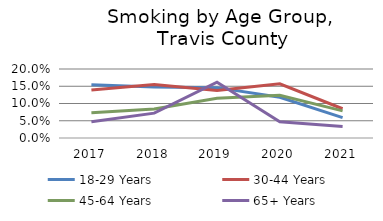
| Category | 18-29 Years  | 30-44 Years  | 45-64 Years | 65+ Years  |
|---|---|---|---|---|
| 2017.0 | 0.154 | 0.139 | 0.073 | 0.047 |
| 2018.0 | 0.148 | 0.155 | 0.084 | 0.072 |
| 2019.0 | 0.146 | 0.138 | 0.115 | 0.162 |
| 2020.0 | 0.118 | 0.157 | 0.124 | 0.047 |
| 2021.0 | 0.059 | 0.085 | 0.079 | 0.034 |